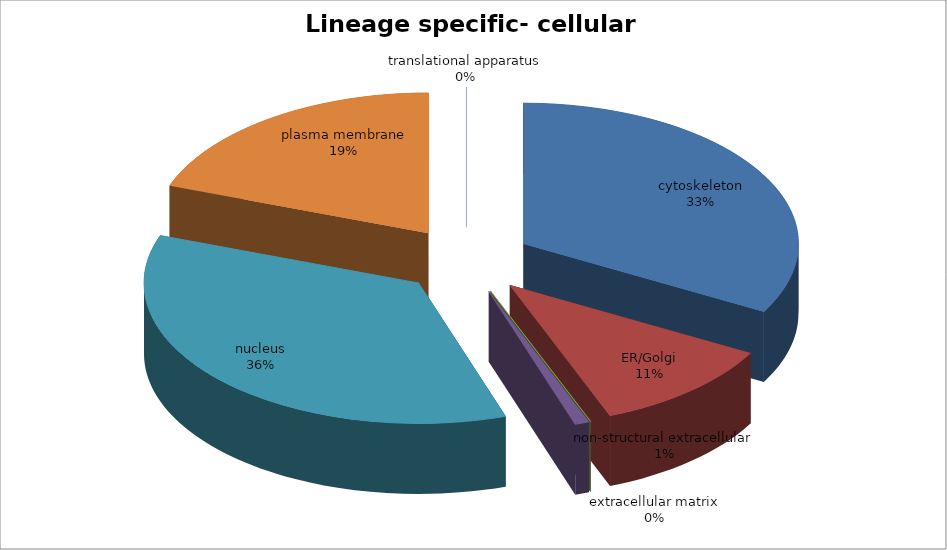
| Category | Series 0 |
|---|---|
| cytoskeleton | 39 |
| ER/Golgi | 13 |
| extracellular matrix | 0 |
| non-structural extracellular | 1 |
| nucleus | 42 |
| plasma membrane | 23 |
| translational apparatus | 0 |